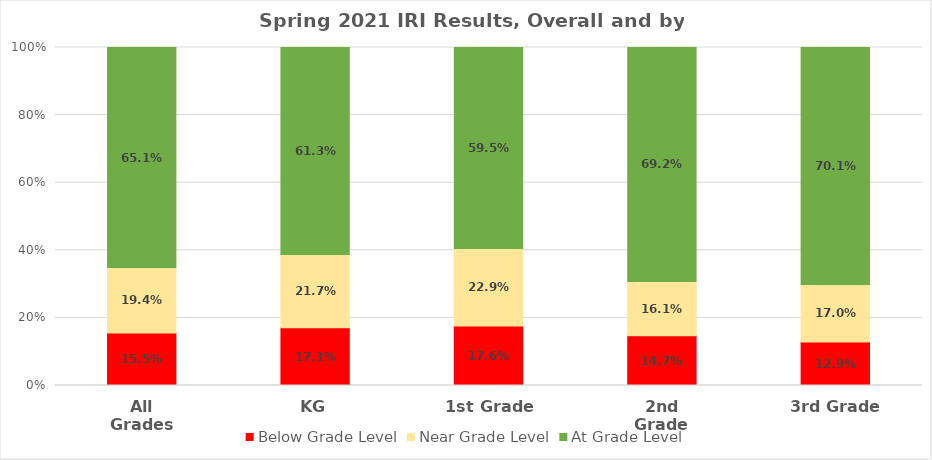
| Category | Below Grade Level | Near Grade Level | At Grade Level |
|---|---|---|---|
| All Grades | 0.155 | 0.194 | 0.651 |
| KG | 0.171 | 0.217 | 0.613 |
| 1st Grade | 0.176 | 0.229 | 0.595 |
| 2nd Grade | 0.147 | 0.161 | 0.692 |
| 3rd Grade | 0.129 | 0.17 | 0.701 |